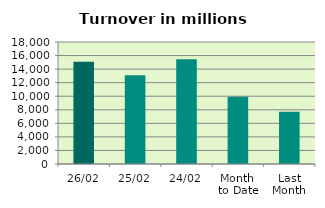
| Category | Series 0 |
|---|---|
| 26/02 | 15071.159 |
| 25/02 | 13096.001 |
| 24/02 | 15448.407 |
| Month 
to Date | 9918.341 |
| Last
Month | 7723.751 |